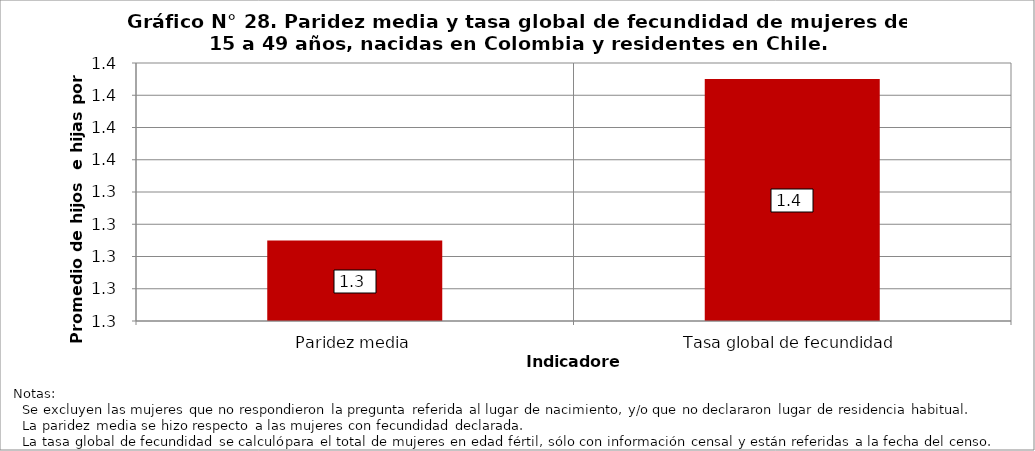
| Category | Colombia |
|---|---|
| Paridez media | 1.3 |
| Tasa global de fecundidad | 1.4 |